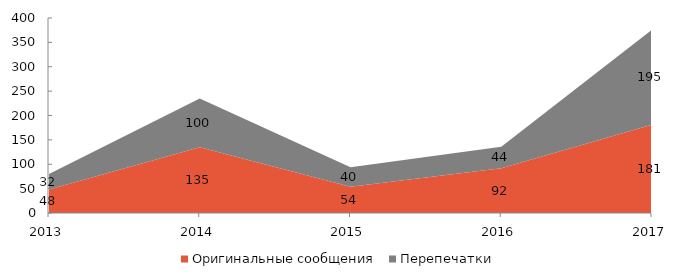
| Category | Оригинальные сообщения | Перепечатки |
|---|---|---|
| 2013 | 48 | 32 |
| 2014 | 135 | 100 |
| 2015 | 54 | 40 |
| 2016 | 92 | 44 |
| 2017 | 181 | 195 |